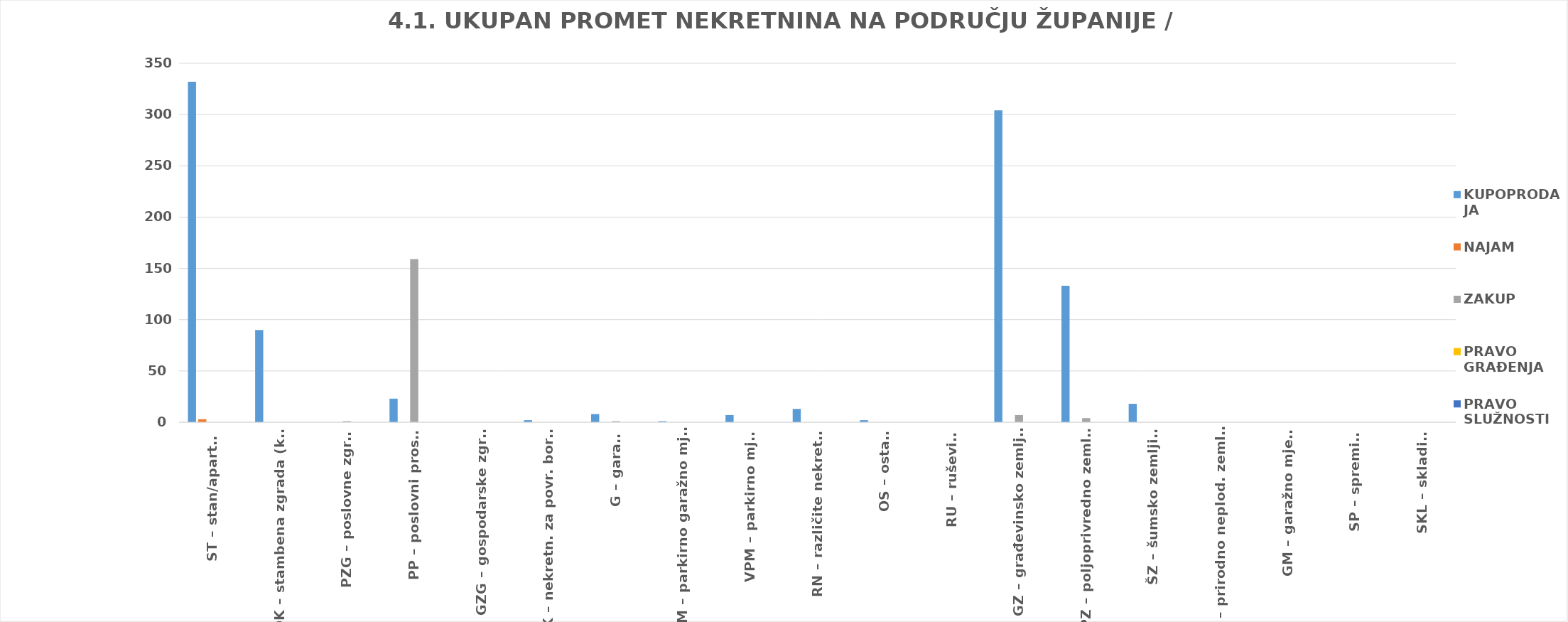
| Category | KUPOPRODAJA | NAJAM | ZAKUP | PRAVO GRAĐENJA | PRAVO SLUŽNOSTI |
|---|---|---|---|---|---|
| ST – stan/apartman | 332 | 3 | 0 | 0 | 0 |
| OK – stambena zgrada (kuća) | 90 | 0 | 0 | 0 | 0 |
| PZG – poslovne zgrade | 0 | 0 | 1 | 0 | 0 |
| PP – poslovni prostori | 23 | 0 | 159 | 0 | 0 |
| GZG – gospodarske zgrade | 0 | 0 | 0 | 0 | 0 |
| VIK – nekretn. za povr. boravak | 2 | 0 | 0 | 0 | 0 |
| G – garaža | 8 | 0 | 1 | 0 | 0 |
| PGM – parkirno garažno mjesto | 1 | 0 | 0 | 0 | 0 |
| VPM – parkirno mjesto | 7 | 0 | 0 | 0 | 0 |
| RN – različite nekretnine | 13 | 0 | 0 | 0 | 0 |
| OS – ostalo | 2 | 0 | 0 | 0 | 0 |
| RU – ruševine | 0 | 0 | 0 | 0 | 0 |
| GZ – građevinsko zemljište | 304 | 0 | 7 | 0 | 0 |
| PZ – poljoprivredno zemljište | 133 | 0 | 4 | 0 | 0 |
| ŠZ – šumsko zemljište | 18 | 0 | 0 | 0 | 0 |
| PNZ – prirodno neplod. zemljište | 0 | 0 | 0 | 0 | 0 |
| GM – garažno mjesto | 0 | 0 | 0 | 0 | 0 |
| SP – spremište | 0 | 0 | 0 | 0 | 0 |
| SKL – skladište | 0 | 0 | 0 | 0 | 0 |